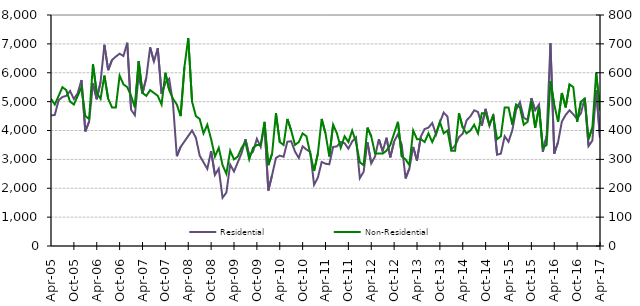
| Category | Residential |
|---|---|
| 2005-04-01 | 4520 |
| 2005-05-01 | 4540 |
| 2005-06-01 | 5050 |
| 2005-07-01 | 5160 |
| 2005-08-01 | 5200 |
| 2005-09-01 | 5370 |
| 2005-10-01 | 5090 |
| 2005-11-01 | 5290 |
| 2005-12-01 | 5750 |
| 2006-01-01 | 3970 |
| 2006-02-01 | 4310 |
| 2006-03-01 | 5630 |
| 2006-04-01 | 5080 |
| 2006-05-01 | 5680 |
| 2006-06-01 | 6970 |
| 2006-07-01 | 6090 |
| 2006-08-01 | 6440 |
| 2006-09-01 | 6560 |
| 2006-10-01 | 6660 |
| 2006-11-01 | 6580 |
| 2006-12-01 | 7040 |
| 2007-01-01 | 4720 |
| 2007-02-01 | 4530 |
| 2007-03-01 | 5940 |
| 2007-04-01 | 5280 |
| 2007-05-01 | 5830 |
| 2007-06-01 | 6880 |
| 2007-07-01 | 6390 |
| 2007-08-01 | 6850 |
| 2007-09-01 | 5270 |
| 2007-10-01 | 5660 |
| 2007-11-01 | 5790 |
| 2007-12-01 | 4940 |
| 2008-01-01 | 3110 |
| 2008-02-01 | 3430 |
| 2008-03-01 | 3620 |
| 2008-04-01 | 3810 |
| 2008-05-01 | 4000 |
| 2008-06-01 | 3750 |
| 2008-07-01 | 3130 |
| 2008-08-01 | 2900 |
| 2008-09-01 | 2670 |
| 2008-10-01 | 3290 |
| 2008-11-01 | 2460 |
| 2008-12-01 | 2680 |
| 2009-01-01 | 1670 |
| 2009-02-01 | 1850 |
| 2009-03-01 | 2820 |
| 2009-04-01 | 2580 |
| 2009-05-01 | 2900 |
| 2009-06-01 | 3220 |
| 2009-07-01 | 3700 |
| 2009-08-01 | 3130 |
| 2009-09-01 | 3270 |
| 2009-10-01 | 3710 |
| 2009-11-01 | 3430 |
| 2009-12-01 | 4210 |
| 2010-01-01 | 1920 |
| 2010-02-01 | 2460 |
| 2010-03-01 | 3050 |
| 2010-04-01 | 3130 |
| 2010-05-01 | 3090 |
| 2010-06-01 | 3610 |
| 2010-07-01 | 3630 |
| 2010-08-01 | 3270 |
| 2010-09-01 | 3050 |
| 2010-10-01 | 3450 |
| 2010-11-01 | 3340 |
| 2010-12-01 | 3260 |
| 2011-01-01 | 2120 |
| 2011-02-01 | 2370 |
| 2011-03-01 | 2910 |
| 2011-04-01 | 2850 |
| 2011-05-01 | 2830 |
| 2011-06-01 | 3430 |
| 2011-07-01 | 3450 |
| 2011-08-01 | 3600 |
| 2011-09-01 | 3560 |
| 2011-10-01 | 3370 |
| 2011-11-01 | 3620 |
| 2011-12-01 | 3760 |
| 2012-01-01 | 2350 |
| 2012-02-01 | 2570 |
| 2012-03-01 | 3600 |
| 2012-04-01 | 2860 |
| 2012-05-01 | 3100 |
| 2012-06-01 | 3700 |
| 2012-07-01 | 3280 |
| 2012-08-01 | 3750 |
| 2012-09-01 | 3070 |
| 2012-10-01 | 3620 |
| 2012-11-01 | 3870 |
| 2012-12-01 | 3510 |
| 2013-01-01 | 2340 |
| 2013-02-01 | 2680 |
| 2013-03-01 | 3430 |
| 2013-04-01 | 2960 |
| 2013-05-01 | 3790 |
| 2013-06-01 | 4050 |
| 2013-07-01 | 4100 |
| 2013-08-01 | 4260 |
| 2013-09-01 | 3860 |
| 2013-10-01 | 4280 |
| 2013-11-01 | 4620 |
| 2013-12-01 | 4480 |
| 2014-01-01 | 3350 |
| 2014-02-01 | 3470 |
| 2014-03-01 | 3770 |
| 2014-04-01 | 3890 |
| 2014-05-01 | 4350 |
| 2014-06-01 | 4490 |
| 2014-07-01 | 4700 |
| 2014-08-01 | 4640 |
| 2014-09-01 | 4170 |
| 2014-10-01 | 4750 |
| 2014-11-01 | 4170 |
| 2014-12-01 | 4560 |
| 2015-01-01 | 3160 |
| 2015-02-01 | 3200 |
| 2015-03-01 | 3800 |
| 2015-04-01 | 3610 |
| 2015-05-01 | 4010 |
| 2015-06-01 | 4720 |
| 2015-07-01 | 4980 |
| 2015-08-01 | 4440 |
| 2015-09-01 | 4370 |
| 2015-10-01 | 5120 |
| 2015-11-01 | 4700 |
| 2015-12-01 | 4900 |
| 2016-01-01 | 3260 |
| 2016-02-01 | 3810 |
| 2016-03-01 | 7020 |
| 2016-04-01 | 3200 |
| 2016-05-01 | 3600 |
| 2016-06-01 | 4310 |
| 2016-07-01 | 4540 |
| 2016-08-01 | 4700 |
| 2016-09-01 | 4560 |
| 2016-10-01 | 4400 |
| 2016-11-01 | 4600 |
| 2016-12-01 | 5130 |
| 2017-01-01 | 3460 |
| 2017-02-01 | 3650 |
| 2017-03-01 | 5400 |
| 2017-04-01 | 3740 |